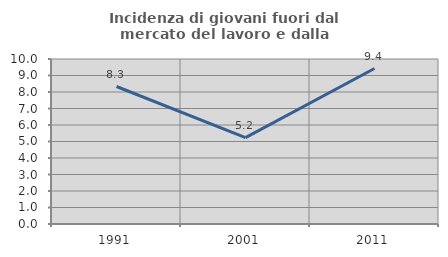
| Category | Incidenza di giovani fuori dal mercato del lavoro e dalla formazione  |
|---|---|
| 1991.0 | 8.333 |
| 2001.0 | 5.236 |
| 2011.0 | 9.424 |